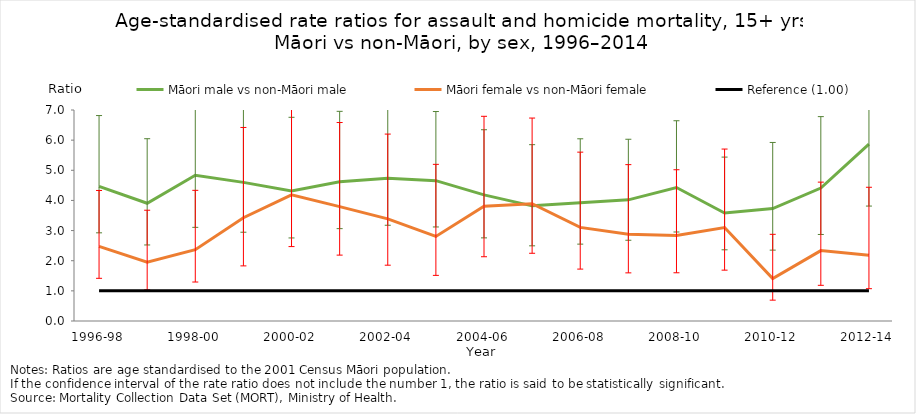
| Category | Māori male vs non-Māori male | Māori female vs non-Māori female | Reference (1.00) |
|---|---|---|---|
| 1996-98 | 4.465 | 2.476 | 1 |
| 1997-99 | 3.906 | 1.949 | 1 |
| 1998-00 | 4.835 | 2.368 | 1 |
| 1999-01 | 4.599 | 3.426 | 1 |
| 2000-02 | 4.315 | 4.183 | 1 |
| 2001-03 | 4.617 | 3.794 | 1 |
| 2002-04 | 4.732 | 3.388 | 1 |
| 2003-05 | 4.656 | 2.805 | 1 |
| 2004-06 | 4.184 | 3.805 | 1 |
| 2005-07 | 3.82 | 3.889 | 1 |
| 2006-08 | 3.926 | 3.105 | 1 |
| 2007-09 | 4.019 | 2.878 | 1 |
| 2008-10 | 4.429 | 2.833 | 1 |
| 2009-11 | 3.584 | 3.102 | 1 |
| 2010-12 | 3.732 | 1.411 | 1 |
| 2011-13 | 4.412 | 2.335 | 1 |
| 2012-14 | 5.868 | 2.181 | 1 |